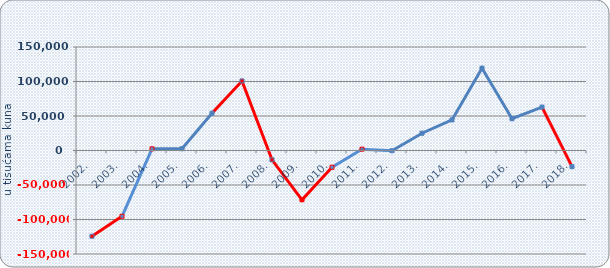
| Category | Neto dobit/gubitak |
|---|---|
| 2002. | -124231 |
| 2003. | -95344.036 |
| 2004. | 2436.128 |
| 2005. | 2570.111 |
| 2006. | 54067.607 |
| 2007. | 100801.461 |
| 2008. | -13516.351 |
| 2009. | -71435.126 |
| 2010. | -24239.572 |
| 2011. | 1954.712 |
| 2012. | -299.182 |
| 2013. | 25029.006 |
| 2014. | 44359.392 |
| 2015. | 119271.921 |
| 2016. | 46028.074 |
| 2017. | 62930.867 |
| 2018. | -23427.734 |